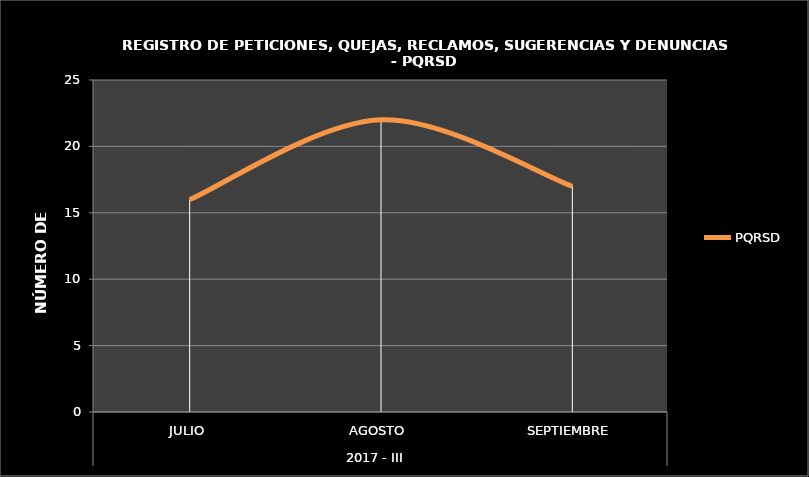
| Category | PQRSD  |
|---|---|
| 0 | 16 |
| 1 | 22 |
| 2 | 17 |